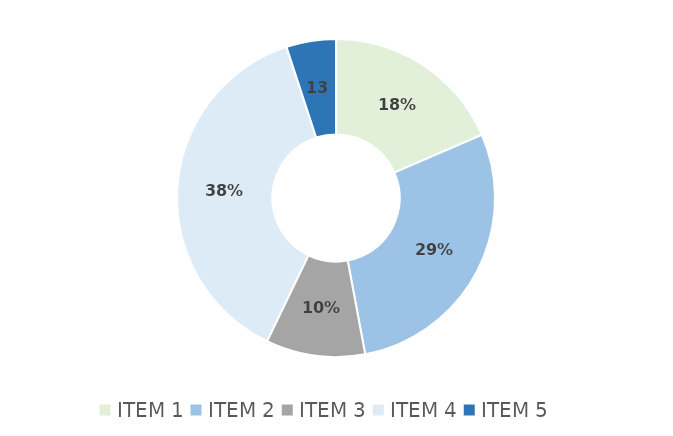
| Category | Series 0 |
|---|---|
| ITEM 1 | 22 |
| ITEM 2 | 34 |
| ITEM 3 | 12 |
| ITEM 4 | 45 |
| ITEM 5 | 6 |